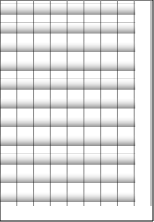
| Category | Series 0 |
|---|---|
| 0 | 8 |
| 1 | 8 |
| 2 | 8 |
| 3 | 8 |
| 4 | 8 |
| 5 | 8 |
| 6 | 8 |
| 7 | 8 |
| 8 | 8 |
| 9 | 8 |
| 10 | 8 |